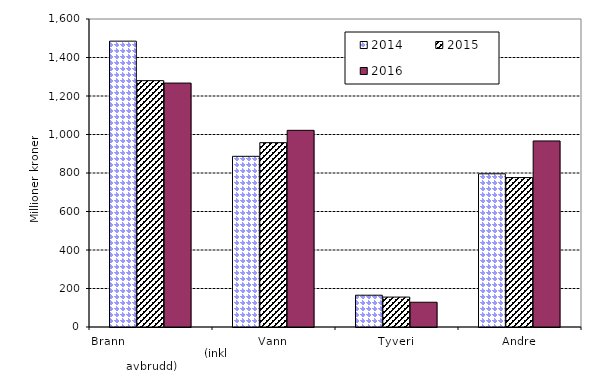
| Category | 2014 | 2015 | 2016 |
|---|---|---|---|
| Brann                                                       (inkl avbrudd) | 1484.915 | 1279.836 | 1267.177 |
| Vann | 886.676 | 957.605 | 1021.63 |
| Tyveri | 165.163 | 155.37 | 128.593 |
| Andre | 795.825 | 776.252 | 966.541 |